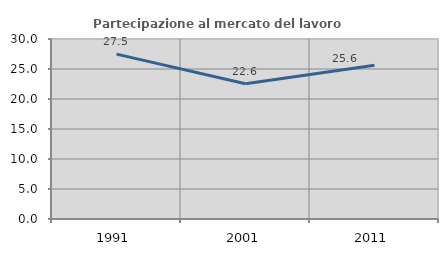
| Category | Partecipazione al mercato del lavoro  femminile |
|---|---|
| 1991.0 | 27.479 |
| 2001.0 | 22.551 |
| 2011.0 | 25.623 |